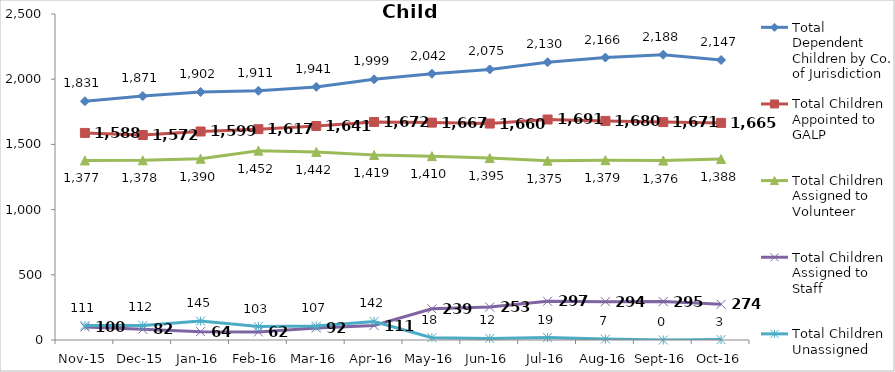
| Category | Total Dependent Children by Co. of Jurisdiction | Total Children Appointed to GALP | Total Children Assigned to Volunteer | Total Children Assigned to Staff | Total Children Unassigned |
|---|---|---|---|---|---|
| Nov-15 | 1831 | 1588 | 1377 | 100 | 111 |
| Dec-15 | 1871 | 1572 | 1378 | 82 | 112 |
| Jan-16 | 1902 | 1599 | 1390 | 64 | 145 |
| Feb-16 | 1911 | 1617 | 1452 | 62 | 103 |
| Mar-16 | 1941 | 1641 | 1442 | 92 | 107 |
| Apr-16 | 1999 | 1672 | 1419 | 111 | 142 |
| May-16 | 2042 | 1667 | 1410 | 239 | 18 |
| Jun-16 | 2075 | 1660 | 1395 | 253 | 12 |
| Jul-16 | 2130 | 1691 | 1375 | 297 | 19 |
| Aug-16 | 2166 | 1680 | 1379 | 294 | 7 |
| Sep-16 | 2188 | 1671 | 1376 | 295 | 0 |
| Oct-16 | 2147 | 1665 | 1388 | 274 | 3 |